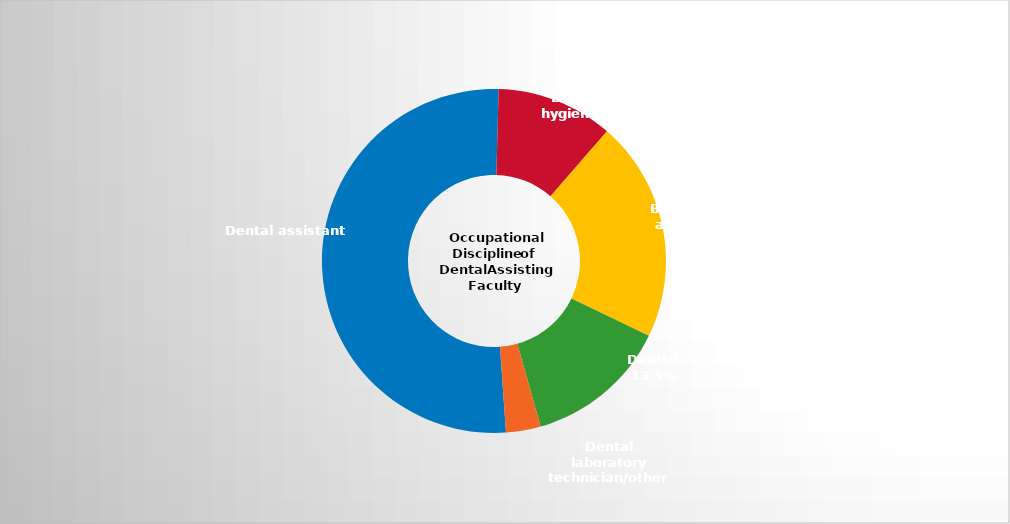
| Category | Series 2 |
|---|---|
| Dental assistant   | 0.515 |
| Dental hygienist | 0.11 |
| Both dental hygienist and dental assistant | 0.208 |
| Dentist | 0.135 |
| Dental laboratory technician/other | 0.033 |